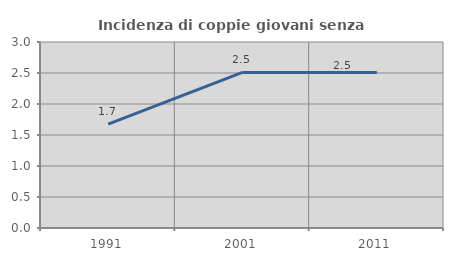
| Category | Incidenza di coppie giovani senza figli |
|---|---|
| 1991.0 | 1.677 |
| 2001.0 | 2.509 |
| 2011.0 | 2.506 |